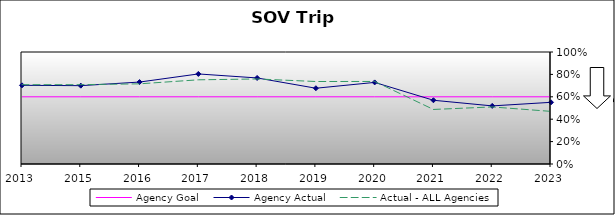
| Category | Agency Goal | Agency Actual | Actual - ALL Agencies |
|---|---|---|---|
| 2013.0 | 0.6 | 0.702 | 0.708 |
| 2015.0 | 0.6 | 0.699 | 0.708 |
| 2016.0 | 0.6 | 0.732 | 0.716 |
| 2017.0 | 0.6 | 0.804 | 0.752 |
| 2018.0 | 0.6 | 0.768 | 0.759 |
| 2019.0 | 0.6 | 0.676 | 0.736 |
| 2020.0 | 0.6 | 0.728 | 0.737 |
| 2021.0 | 0.6 | 0.569 | 0.487 |
| 2022.0 | 0.6 | 0.519 | 0.509 |
| 2023.0 | 0.6 | 0.551 | 0.47 |